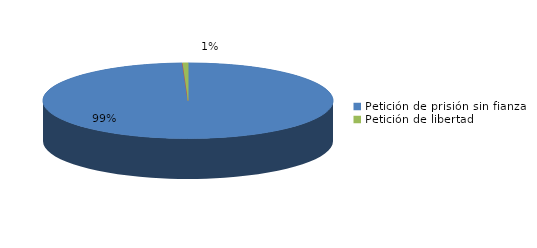
| Category | Series 0 |
|---|---|
| Petición de prisión sin fianza | 165 |
| Peticion de libertad con fianza | 0 |
| Petición de libertad | 1 |